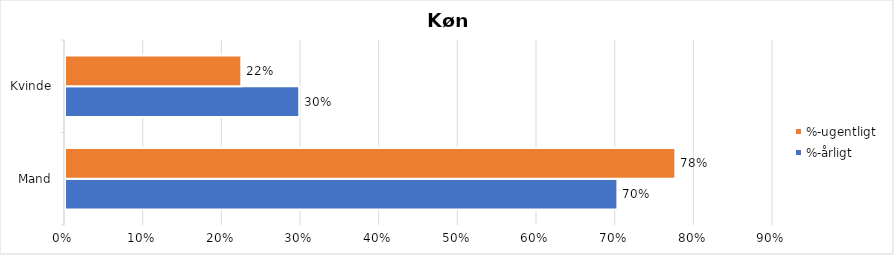
| Category | %-årligt | %-ugentligt |
|---|---|---|
| Mand | 0.702 | 0.776 |
| Kvinde | 0.298 | 0.224 |